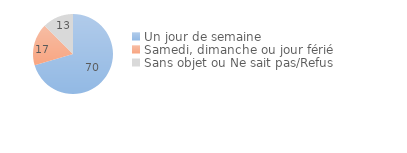
| Category | Series 0 |
|---|---|
| Un jour de semaine | 70.433 |
| Samedi, dimanche ou jour férié | 17.026 |
| Sans objet ou Ne sait pas/Refus | 12.541 |